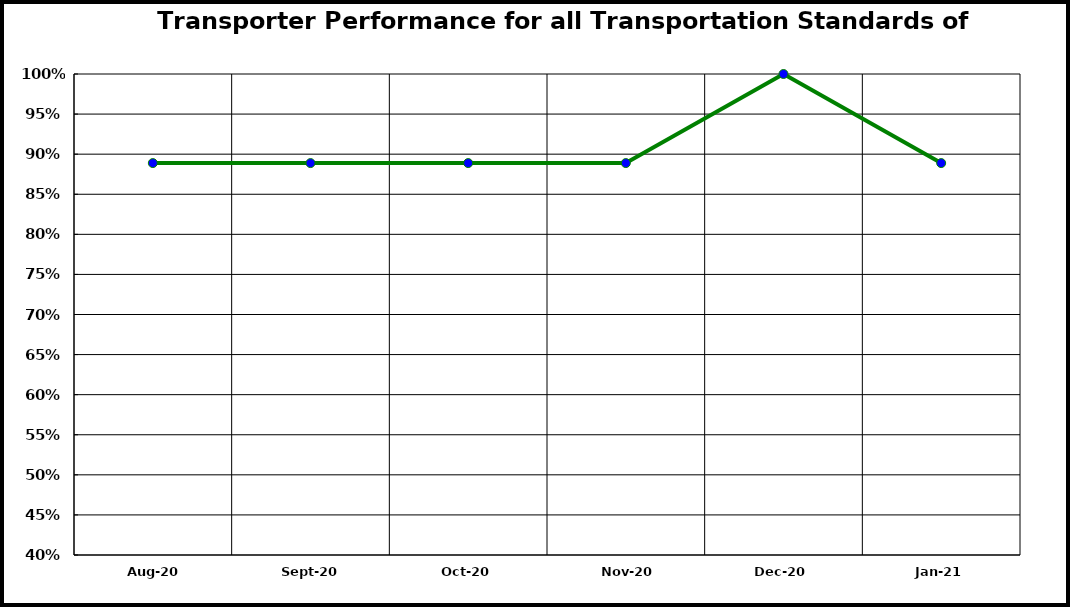
| Category | Performance |
|---|---|
| 2020-08-01 | 0.889 |
| 2020-09-01 | 0.889 |
| 2020-10-01 | 0.889 |
| 2020-11-01 | 0.889 |
| 2020-12-01 | 1 |
| 2021-01-01 | 0.889 |